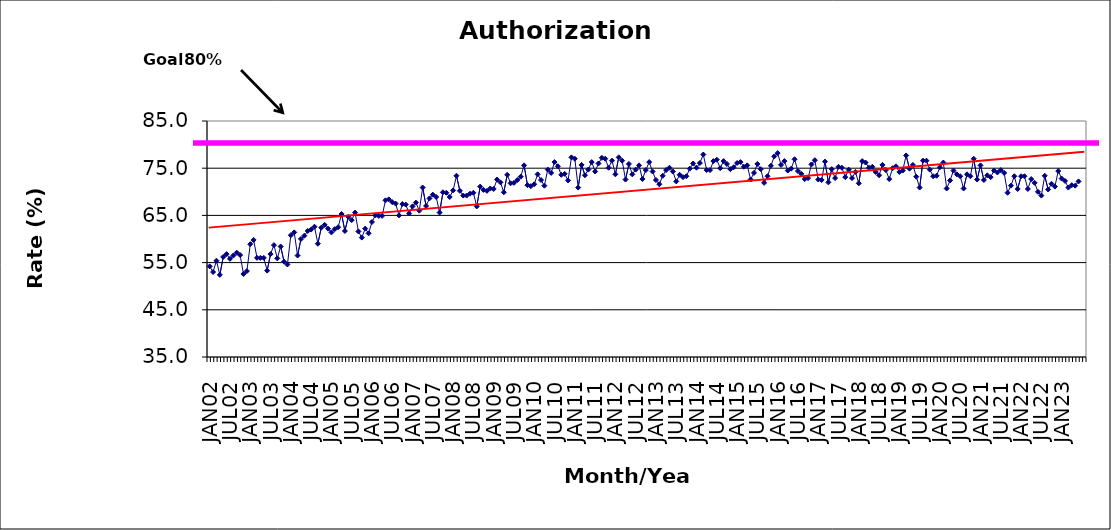
| Category | Series 0 |
|---|---|
| JAN02 | 54.2 |
| FEB02 | 53 |
| MAR02 | 55.4 |
| APR02 | 52.4 |
| MAY02 | 56.2 |
| JUN02 | 56.8 |
| JUL02 | 55.8 |
| AUG02 | 56.5 |
| SEP02 | 57.1 |
| OCT02 | 56.6 |
| NOV02 | 52.6 |
| DEC02 | 53.2 |
| JAN03 | 58.9 |
| FEB03 | 59.8 |
| MAR03 | 56 |
| APR03 | 56 |
| MAY03 | 56 |
| JUN03 | 53.3 |
| JUL03 | 56.8 |
| AUG03 | 58.7 |
| SEP03 | 55.9 |
| OCT03 | 58.4 |
| NOV03 | 55.2 |
| DEC03 | 54.6 |
| JAN04 | 60.8 |
| FEB04 | 61.4 |
| MAR04 | 56.5 |
| APR04 | 60 |
| MAY04 | 60.7 |
| JUN04 | 61.7 |
| JUL04 | 62 |
| AUG04 | 62.6 |
| SEP04 | 59 |
| OCT04 | 62.4 |
| NOV04 | 63 |
| DEC04 | 62.2 |
| JAN05 | 61.4 |
| FEB05 | 62.1 |
| MAR05 | 62.5 |
| APR05 | 65.3 |
| MAY05 | 61.7 |
| JUN05 | 64.7 |
| JUL05 | 64 |
| AUG05 | 65.6 |
| SEP05 | 61.6 |
| OCT05 | 60.3 |
| NOV05 | 62.2 |
| DEC05 | 61.2 |
| JAN06 | 63.6 |
| FEB06 | 65 |
| MAR06 | 64.9 |
| APR06 | 64.9 |
| MAY06 | 68.2 |
| JUN06 | 68.4 |
| JUL06 | 67.8 |
| AUG06 | 67.5 |
| SEP06 | 65 |
| OCT06 | 67.4 |
| NOV06 | 67.3 |
| DEC06 | 65.4 |
| JAN07 | 66.9 |
| FEB07 | 67.7 |
| MAR07 | 66 |
| APR07 | 70.9 |
| MAY07 | 67 |
| JUN07 | 68.6 |
| JUL07 | 69.4 |
| AUG07 | 68.9 |
| SEP07 | 65.6 |
| OCT07 | 69.9 |
| NOV07 | 69.8 |
| DEC07 | 68.9 |
| JAN08 | 70.3 |
| FEB08 | 73.4 |
| MAR08 | 70.2 |
| APR08 | 69.2 |
| MAY08 | 69.2 |
| JUN08 | 69.6 |
| JUL08 | 69.8 |
| AUG08 | 66.9 |
| SEP08 | 71.1 |
| OCT08 | 70.4 |
| NOV08 | 70.2 |
| DEC08 | 70.7 |
| JAN09 | 70.6 |
| FEB09 | 72.6 |
| MAR09 | 72 |
| APR09 | 69.9 |
| MAY09 | 73.6 |
| JUN09 | 71.8 |
| JUL09 | 71.9 |
| AUG09 | 72.5 |
| SEP09 | 73.2 |
| OCT09 | 75.6 |
| NOV09 | 71.4 |
| DEC09 | 71.2 |
| JAN10 | 71.6 |
| FEB10 | 73.7 |
| MAR10 | 72.5 |
| APR10 | 71.3 |
| MAY10 | 74.7 |
| JUN10 | 74 |
| JUL10 | 76.3 |
| AUG10 | 75.4 |
| SEP10 | 73.6 |
| OCT10 | 73.8 |
| NOV10 | 72.4 |
| DEC10 | 77.3 |
| JAN11 | 77 |
| FEB11 | 70.9 |
| MAR11 | 75.7 |
| APR11 | 73.5 |
| MAY11 | 74.7 |
| JUN11 | 76.3 |
| JUL11 | 74.3 |
| AUG11 | 76 |
| SEP11 | 77.2 |
| OCT11 | 77 |
| NOV11 | 75.1 |
| DEC11 | 76.6 |
| JAN12 | 73.7 |
| FEB12 | 77.3 |
| MAR12 | 76.6 |
| APR12 | 72.6 |
| MAY12 | 75.9 |
| JUN12 | 73.7 |
| JUL12 | 74.7 |
| AUG12 | 75.6 |
| SEP12 | 72.7 |
| OCT12 | 74.6 |
| NOV12 | 76.3 |
| DEC12 | 74.3 |
| JAN13 | 72.5 |
| FEB13 | 71.6 |
| MAR13 | 73.4 |
| APR13 | 74.6 |
| MAY13 | 75.1 |
| JUN13 | 74.3 |
| JUL13 | 72.2 |
| AUG13 | 73.6 |
| SEP13 | 73.1 |
| OCT13 | 73.3 |
| NOV13 | 74.9 |
| DEC13 | 76 |
| JAN14 | 75.1 |
| FEB14 | 76.1 |
| MAR14 | 77.9 |
| APR14 | 74.6 |
| MAY14 | 74.6 |
| JUN14 | 76.5 |
| JUL14 | 76.8 |
| AUG14 | 75 |
| SEP14 | 76.5 |
| OCT14 | 75.9 |
| NOV14 | 74.8 |
| DEC14 | 75.2 |
| JAN15 | 76.1 |
| FEB15 | 76.3 |
| MAR15 | 75.3 |
| APR15 | 75.6 |
| MAY15 | 72.6 |
| JUN15 | 74 |
| JUL15 | 75.9 |
| AUG15 | 74.8 |
| SEP15 | 71.9 |
| OCT15 | 73.3 |
| NOV15 | 75.5 |
| DEC15 | 77.5 |
| JAN16 | 78.2 |
| FEB16 | 75.7 |
| MAR16 | 76.5 |
| APR16 | 74.5 |
| MAY16 | 74.9 |
| JUN16 | 76.9 |
| JUL16 | 74.4 |
| AUG16 | 73.8 |
| SEP16 | 72.7 |
| OCT16 | 72.9 |
| NOV16 | 75.8 |
| DEC16 | 76.7 |
| JAN17 | 72.6 |
| FEB17 | 72.5 |
| MAR17 | 76.4 |
| APR17 | 72 |
| MAY17 | 74.8 |
| JUN17 | 72.9 |
| JUL17 | 75.3 |
| AUG17 | 75.1 |
| SEP17 | 73.1 |
| OCT17 | 74.7 |
| NOV17 | 72.9 |
| DEC17 | 74.2 |
| JAN18 | 71.8 |
| FEB18 | 76.5 |
| MAR18 | 76.2 |
| APR18 | 75.1 |
| MAY18 | 75.3 |
| JUN18 | 74.2 |
| JUL18 | 73.5 |
| AUG18 | 75.7 |
| SEP18 | 74.6 |
| OCT18 | 72.7 |
| NOV18 | 75 |
| DEC18 | 75.4 |
| JAN19 | 74.2 |
| FEB19 | 74.5 |
| MAR19 | 77.7 |
| APR19 | 74.9 |
| MAY19 | 75.7 |
| JUN19 | 73.2 |
| JUL19 | 70.9 |
| AUG19 | 76.6 |
| SEP19 | 76.6 |
| OCT19 | 74.7 |
| NOV19 | 73.3 |
| DEC19 | 73.4 |
| JAN20 | 75.2 |
| FEB20 | 76.2 |
| MAR20 | 70.7 |
| APR20 | 72.4 |
| MAY20 | 74.5 |
| JUN20 | 73.7 |
| JUL20 | 73.3 |
| AUG20 | 70.7 |
| SEP20 | 73.7 |
| OCT20 | 73.3 |
| NOV20 | 77 |
| DEC20 | 72.6 |
| JAN21 | 75.6 |
| FEB21 | 72.5 |
| MAR21 | 73.5 |
| APR21 | 73.1 |
| MAY21 | 74.5 |
| JUN21 | 74.1 |
| JUL21 | 74.6 |
| AUG21 | 74 |
| SEP21 | 69.8 |
| OCT21 | 71.3 |
| NOV21 | 73.3 |
| DEC21 | 70.6 |
| JAN22 | 73.3 |
| FEB22 | 73.3 |
| MAR22 | 70.6 |
| APR22 | 72.7 |
| MAY22 | 71.9 |
| JUN22 | 70 |
| JUL22 | 69.2 |
| AUG22 | 73.4 |
| SEP22 | 70.5 |
| OCT22 | 71.7 |
| NOV22 | 71.1 |
| DEC22 | 74.4 |
| JAN23 | 72.8 |
| FEB23 | 72.3 |
| MAR23 | 70.9 |
| APR23 | 71.4 |
| MAY23 | 71.3 |
| JUN23 | 72.2 |